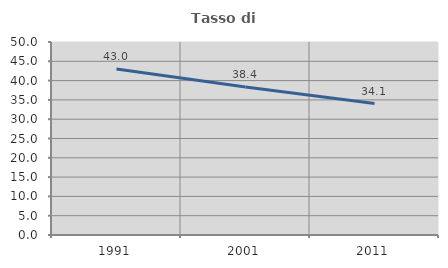
| Category | Tasso di occupazione   |
|---|---|
| 1991.0 | 42.995 |
| 2001.0 | 38.356 |
| 2011.0 | 34.058 |